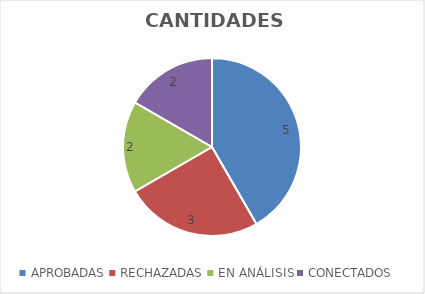
| Category | Series 0 |
|---|---|
| APROBADAS | 5 |
| RECHAZADAS | 3 |
| EN ANÁLISIS | 2 |
| CONECTADOS | 2 |